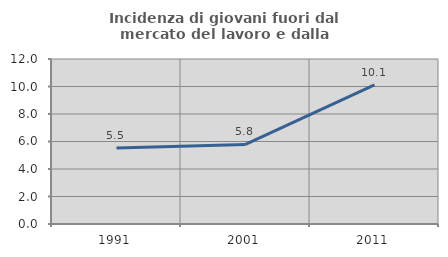
| Category | Incidenza di giovani fuori dal mercato del lavoro e dalla formazione  |
|---|---|
| 1991.0 | 5.523 |
| 2001.0 | 5.784 |
| 2011.0 | 10.11 |